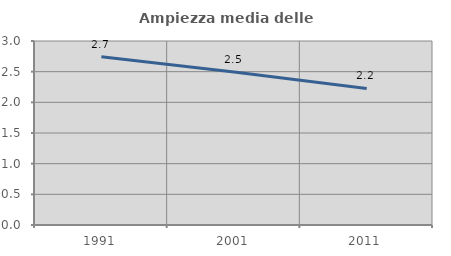
| Category | Ampiezza media delle famiglie |
|---|---|
| 1991.0 | 2.742 |
| 2001.0 | 2.493 |
| 2011.0 | 2.227 |